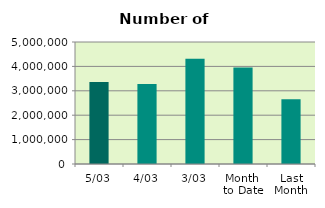
| Category | Series 0 |
|---|---|
| 5/03 | 3355708 |
| 4/03 | 3276906 |
| 3/03 | 4311302 |
| Month 
to Date | 3956292 |
| Last
Month | 2656039 |